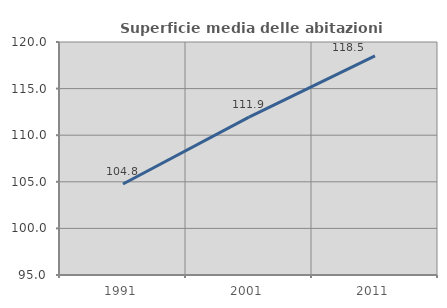
| Category | Superficie media delle abitazioni occupate |
|---|---|
| 1991.0 | 104.762 |
| 2001.0 | 111.933 |
| 2011.0 | 118.502 |